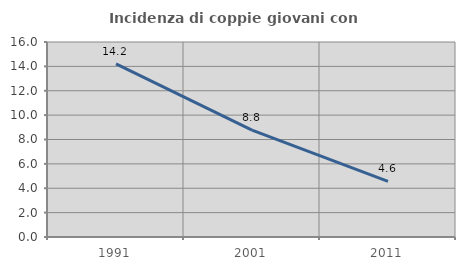
| Category | Incidenza di coppie giovani con figli |
|---|---|
| 1991.0 | 14.2 |
| 2001.0 | 8.768 |
| 2011.0 | 4.556 |